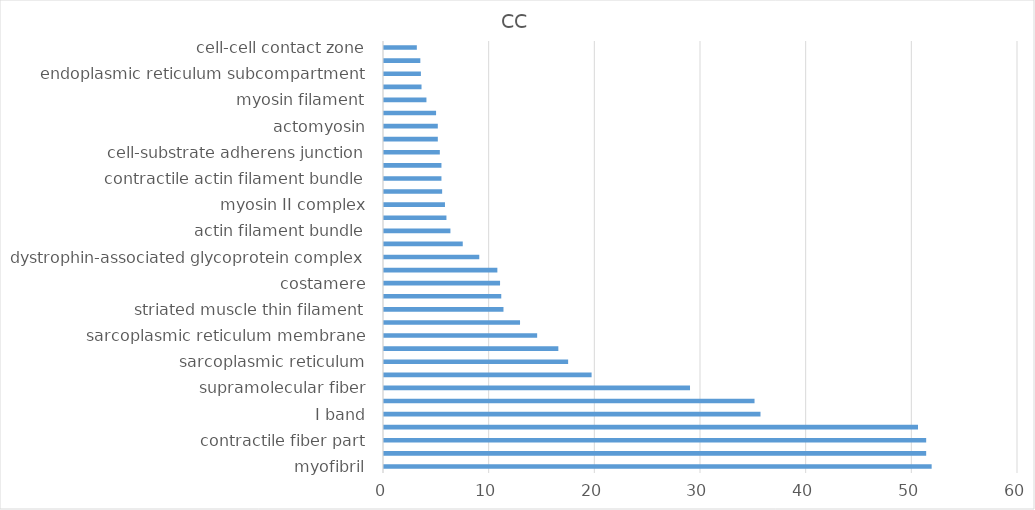
| Category | Bejamini2 |
|---|---|
| myofibril | 51.829 |
| contractile fiber | 51.31 |
| contractile fiber part | 51.31 |
| sarcomere | 50.536 |
| I band | 35.63 |
| Z disc | 35.066 |
| supramolecular fiber | 28.959 |
| A band | 19.646 |
| sarcoplasmic reticulum | 17.426 |
| sarcoplasm | 16.499 |
| sarcoplasmic reticulum membrane | 14.494 |
| M band | 12.874 |
| striated muscle thin filament | 11.307 |
| myofilament | 11.098 |
| costamere | 10.983 |
| sarcolemma | 10.728 |
| dystrophin-associated glycoprotein complex | 9.016 |
| dystroglycan complex | 7.453 |
| actin filament bundle | 6.286 |
| myosin complex | 5.909 |
| myosin II complex | 5.77 |
| sarcoglycan complex | 5.502 |
| contractile actin filament bundle | 5.437 |
| stress fiber | 5.437 |
| cell-substrate adherens junction | 5.283 |
| junctional membrane complex | 5.093 |
| actomyosin | 5.092 |
| muscle myosin complex | 4.928 |
| myosin filament | 4.016 |
| intercalated disc | 3.551 |
| endoplasmic reticulum subcompartment | 3.493 |
| calcium channel complex | 3.438 |
| cell-cell contact zone | 3.107 |